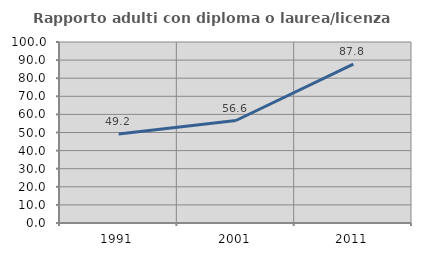
| Category | Rapporto adulti con diploma o laurea/licenza media  |
|---|---|
| 1991.0 | 49.206 |
| 2001.0 | 56.627 |
| 2011.0 | 87.755 |